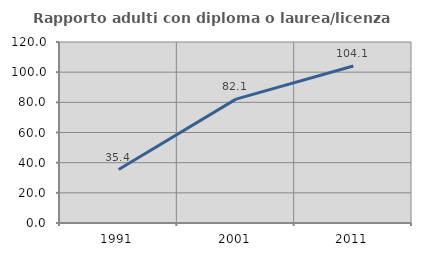
| Category | Rapporto adulti con diploma o laurea/licenza media  |
|---|---|
| 1991.0 | 35.45 |
| 2001.0 | 82.126 |
| 2011.0 | 104.082 |